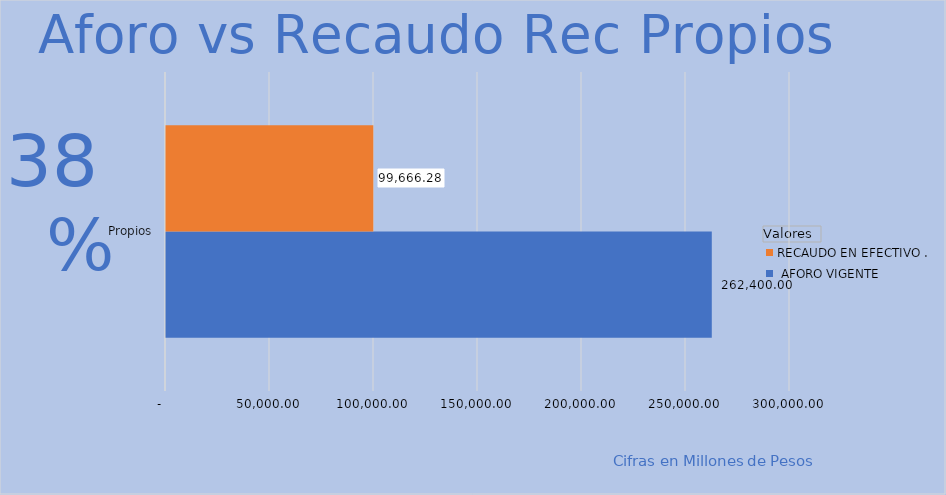
| Category |  AFORO VIGENTE
 | RECAUDO EN EFECTIVO . |
|---|---|---|
| Propios | 262400.001 | 99666.28 |